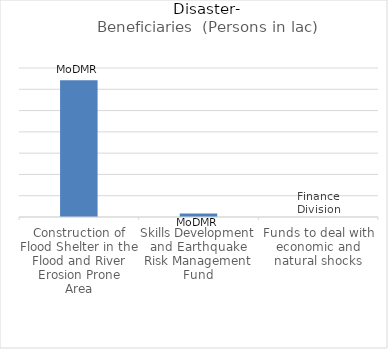
| Category | Beneficiaries  (Persons in lac) |
|---|---|
| Construction of Flood Shelter in the Flood and River Erosion Prone
Area | 6.42 |
| Skills Development and Earthquake Risk Management
Fund | 0.17 |
| Funds to deal with economic and
natural shocks | 0 |